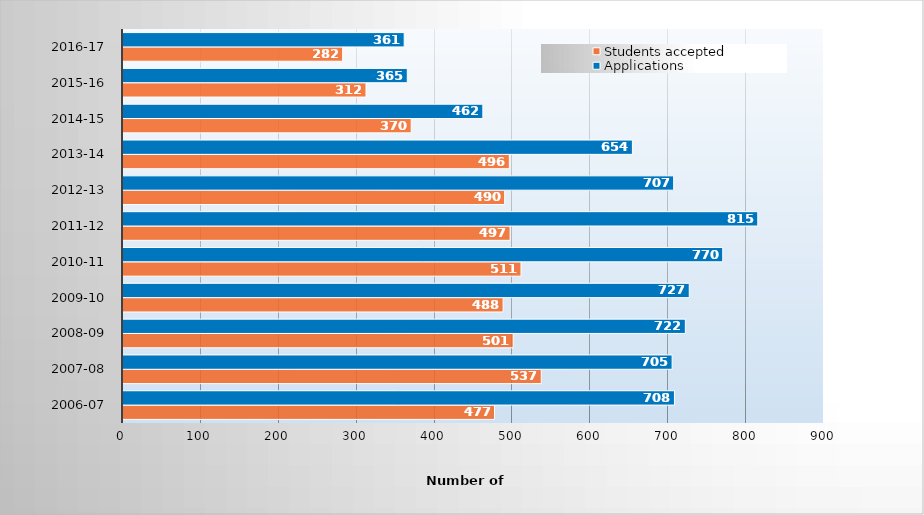
| Category | Students accepted | Applications |
|---|---|---|
| 2006-07 | 477 | 708 |
| 2007-08 | 537 | 705 |
| 2008-09 | 501 | 722 |
| 2009-10 | 488 | 727 |
| 2010-11 | 511 | 770 |
| 2011-12 | 497 | 815 |
| 2012-13 | 490 | 707 |
| 2013-14 | 496 | 654 |
| 2014-15 | 370 | 462 |
| 2015-16 | 312 | 365 |
| 2016-17 | 282 | 361 |